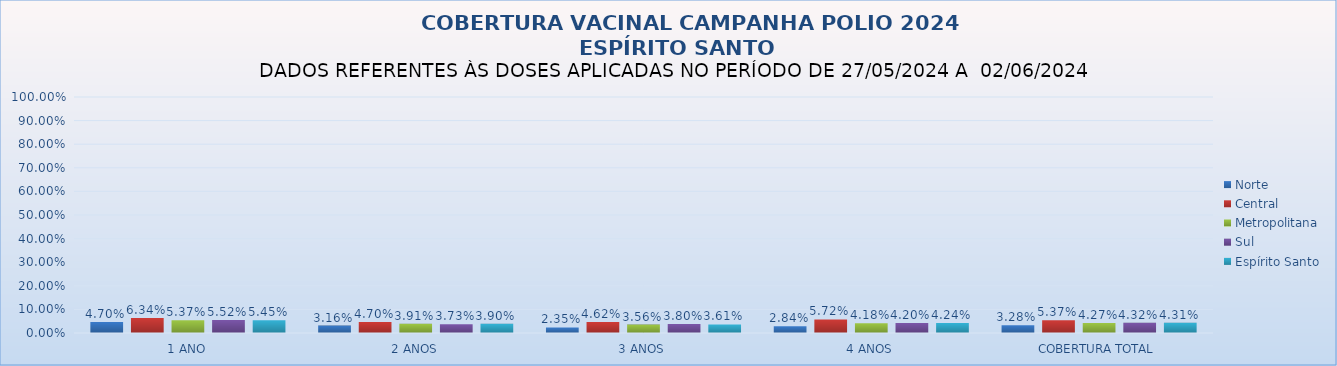
| Category | Norte | Central | Metropolitana | Sul | Espírito Santo |
|---|---|---|---|---|---|
| 1 ANO | 0.047 | 0.063 | 0.054 | 0.055 | 0.055 |
| 2 ANOS | 0.032 | 0.047 | 0.039 | 0.037 | 0.039 |
| 3 ANOS | 0.024 | 0.046 | 0.036 | 0.038 | 0.036 |
| 4 ANOS | 0.028 | 0.057 | 0.042 | 0.042 | 0.042 |
| COBERTURA TOTAL | 0.033 | 0.054 | 0.043 | 0.043 | 0.043 |